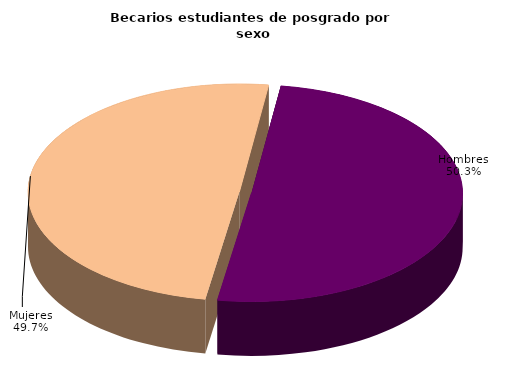
| Category | Series 0 |
|---|---|
| Hombres | 12735 |
| Mujeres | 12560 |